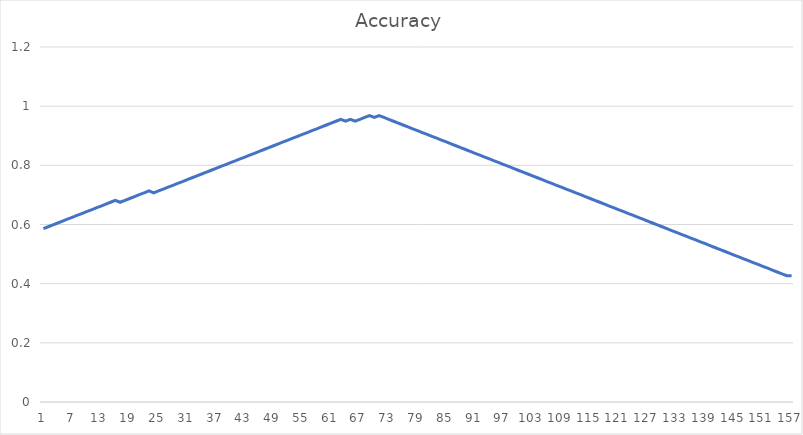
| Category | Accuracy |
|---|---|
| 0 | 0.586 |
| 1 | 0.592 |
| 2 | 0.599 |
| 3 | 0.605 |
| 4 | 0.611 |
| 5 | 0.618 |
| 6 | 0.624 |
| 7 | 0.631 |
| 8 | 0.637 |
| 9 | 0.643 |
| 10 | 0.65 |
| 11 | 0.656 |
| 12 | 0.662 |
| 13 | 0.669 |
| 14 | 0.675 |
| 15 | 0.682 |
| 16 | 0.675 |
| 17 | 0.682 |
| 18 | 0.688 |
| 19 | 0.694 |
| 20 | 0.701 |
| 21 | 0.707 |
| 22 | 0.713 |
| 23 | 0.707 |
| 24 | 0.713 |
| 25 | 0.72 |
| 26 | 0.726 |
| 27 | 0.732 |
| 28 | 0.739 |
| 29 | 0.745 |
| 30 | 0.752 |
| 31 | 0.758 |
| 32 | 0.764 |
| 33 | 0.771 |
| 34 | 0.777 |
| 35 | 0.783 |
| 36 | 0.79 |
| 37 | 0.796 |
| 38 | 0.803 |
| 39 | 0.809 |
| 40 | 0.815 |
| 41 | 0.822 |
| 42 | 0.828 |
| 43 | 0.834 |
| 44 | 0.841 |
| 45 | 0.847 |
| 46 | 0.854 |
| 47 | 0.86 |
| 48 | 0.866 |
| 49 | 0.873 |
| 50 | 0.879 |
| 51 | 0.885 |
| 52 | 0.892 |
| 53 | 0.898 |
| 54 | 0.904 |
| 55 | 0.911 |
| 56 | 0.917 |
| 57 | 0.924 |
| 58 | 0.93 |
| 59 | 0.936 |
| 60 | 0.943 |
| 61 | 0.949 |
| 62 | 0.955 |
| 63 | 0.949 |
| 64 | 0.955 |
| 65 | 0.949 |
| 66 | 0.955 |
| 67 | 0.962 |
| 68 | 0.968 |
| 69 | 0.962 |
| 70 | 0.968 |
| 71 | 0.962 |
| 72 | 0.955 |
| 73 | 0.949 |
| 74 | 0.943 |
| 75 | 0.936 |
| 76 | 0.93 |
| 77 | 0.924 |
| 78 | 0.917 |
| 79 | 0.911 |
| 80 | 0.904 |
| 81 | 0.898 |
| 82 | 0.892 |
| 83 | 0.885 |
| 84 | 0.879 |
| 85 | 0.873 |
| 86 | 0.866 |
| 87 | 0.86 |
| 88 | 0.854 |
| 89 | 0.847 |
| 90 | 0.841 |
| 91 | 0.834 |
| 92 | 0.828 |
| 93 | 0.822 |
| 94 | 0.815 |
| 95 | 0.809 |
| 96 | 0.803 |
| 97 | 0.796 |
| 98 | 0.79 |
| 99 | 0.783 |
| 100 | 0.777 |
| 101 | 0.771 |
| 102 | 0.764 |
| 103 | 0.758 |
| 104 | 0.752 |
| 105 | 0.745 |
| 106 | 0.739 |
| 107 | 0.732 |
| 108 | 0.726 |
| 109 | 0.72 |
| 110 | 0.713 |
| 111 | 0.707 |
| 112 | 0.701 |
| 113 | 0.694 |
| 114 | 0.688 |
| 115 | 0.682 |
| 116 | 0.675 |
| 117 | 0.669 |
| 118 | 0.662 |
| 119 | 0.656 |
| 120 | 0.65 |
| 121 | 0.643 |
| 122 | 0.637 |
| 123 | 0.631 |
| 124 | 0.624 |
| 125 | 0.618 |
| 126 | 0.611 |
| 127 | 0.605 |
| 128 | 0.599 |
| 129 | 0.592 |
| 130 | 0.586 |
| 131 | 0.58 |
| 132 | 0.573 |
| 133 | 0.567 |
| 134 | 0.561 |
| 135 | 0.554 |
| 136 | 0.548 |
| 137 | 0.541 |
| 138 | 0.535 |
| 139 | 0.529 |
| 140 | 0.522 |
| 141 | 0.516 |
| 142 | 0.51 |
| 143 | 0.503 |
| 144 | 0.497 |
| 145 | 0.49 |
| 146 | 0.484 |
| 147 | 0.478 |
| 148 | 0.471 |
| 149 | 0.465 |
| 150 | 0.459 |
| 151 | 0.452 |
| 152 | 0.446 |
| 153 | 0.439 |
| 154 | 0.433 |
| 155 | 0.427 |
| 156 | 0.427 |